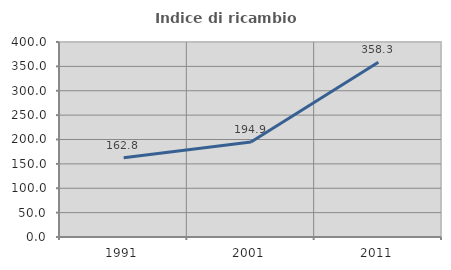
| Category | Indice di ricambio occupazionale  |
|---|---|
| 1991.0 | 162.763 |
| 2001.0 | 194.909 |
| 2011.0 | 358.291 |